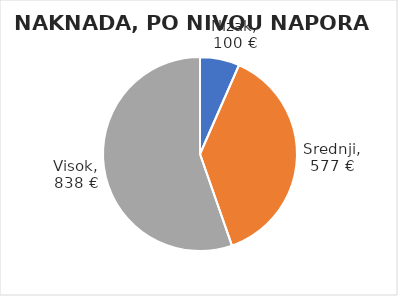
| Category | Ukupna naknada |
|---|---|
| Nizak | 99.583 |
| Srednji | 576.5 |
| Visok | 837.917 |